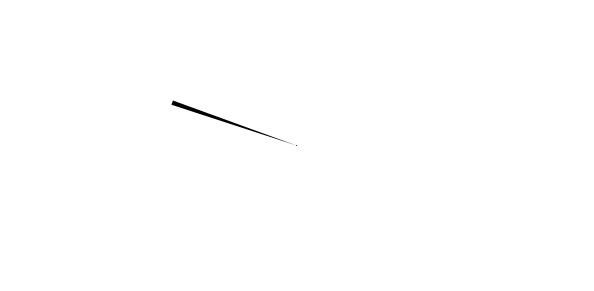
| Category | Wskaźnik |
|---|---|
| 0 | 180 |
| 1 | 18 |
| 2 | 2 |
| 3 | 160 |